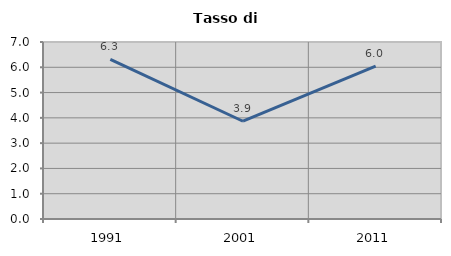
| Category | Tasso di disoccupazione   |
|---|---|
| 1991.0 | 6.316 |
| 2001.0 | 3.866 |
| 2011.0 | 6.044 |